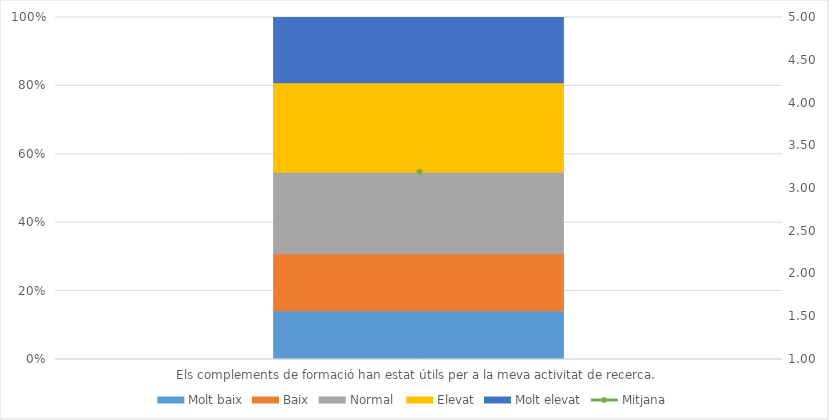
| Category | Molt baix | Baix | Normal  | Elevat | Molt elevat |
|---|---|---|---|---|---|
| Els complements de formació han estat útils per a la meva activitat de recerca. | 6 | 7 | 10 | 11 | 8 |